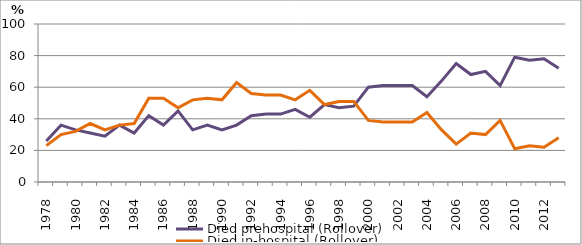
| Category | Died prehospital (Rollover) | Died in-hospital (Rollover) |
|---|---|---|
| 1978.0 | 26 | 23 |
| 1979.0 | 36 | 30 |
| 1980.0 | 33 | 32 |
| 1981.0 | 31 | 37 |
| 1982.0 | 29 | 33 |
| 1983.0 | 36 | 36 |
| 1984.0 | 31 | 37 |
| 1985.0 | 42 | 53 |
| 1986.0 | 36 | 53 |
| 1987.0 | 45 | 47 |
| 1988.0 | 33 | 52 |
| 1989.0 | 36 | 53 |
| 1990.0 | 33 | 52 |
| 1991.0 | 36 | 63 |
| 1992.0 | 42 | 56 |
| 1993.0 | 43 | 55 |
| 1994.0 | 43 | 55 |
| 1995.0 | 46 | 52 |
| 1996.0 | 41 | 58 |
| 1997.0 | 49 | 49 |
| 1998.0 | 47 | 51 |
| 1999.0 | 48 | 51 |
| 2000.0 | 60 | 39 |
| 2001.0 | 61 | 38 |
| 2002.0 | 61 | 38 |
| 2003.0 | 61 | 38 |
| 2004.0 | 54 | 44 |
| 2005.0 | 64 | 33 |
| 2006.0 | 75 | 24 |
| 2007.0 | 68 | 31 |
| 2008.0 | 70 | 30 |
| 2009.0 | 61 | 39 |
| 2010.0 | 79 | 21 |
| 2011.0 | 77 | 23 |
| 2012.0 | 78 | 22 |
| 2013.0 | 72 | 28 |